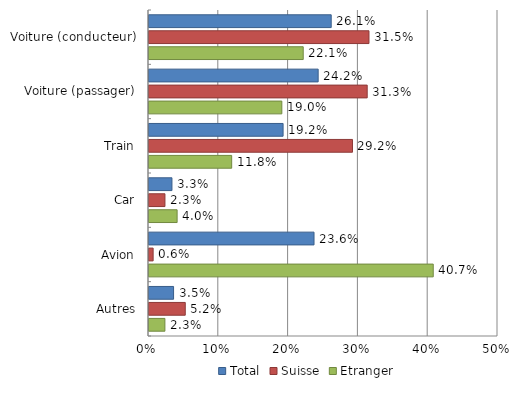
| Category | Total | Suisse | Etranger |
|---|---|---|---|
| Voiture (conducteur) | 26.105 | 31.516 | 22.095 |
| Voiture (passager) | 24.236 | 31.26 | 19.03 |
| Train | 19.211 | 29.152 | 11.844 |
| Car | 3.286 | 2.285 | 4.028 |
| Avion | 23.642 | 0.592 | 40.723 |
| Autres | 3.52 | 5.195 | 2.278 |